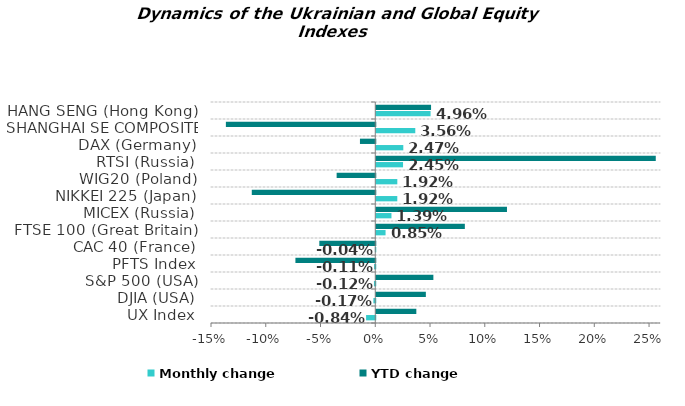
| Category | Monthly change | YTD change |
|---|---|---|
| UX Index | -0.008 | 0.037 |
| DJIA (USA) | -0.002 | 0.045 |
| S&P 500 (USA) | -0.001 | 0.052 |
| PFTS Index | -0.001 | -0.073 |
| CAC 40 (France) | 0 | -0.051 |
| FTSE 100 (Great Britain) | 0.008 | 0.081 |
| MICEX (Russia) | 0.014 | 0.119 |
| NIKKEI 225 (Japan) | 0.019 | -0.113 |
| WIG20 (Poland) | 0.019 | -0.035 |
| RTSI (Russia) | 0.024 | 0.255 |
| DAX (Germany) | 0.025 | -0.014 |
| SHANGHAI SE COMPOSITE (China) | 0.036 | -0.136 |
| HANG SENG (Hong Kong) | 0.05 | 0.05 |